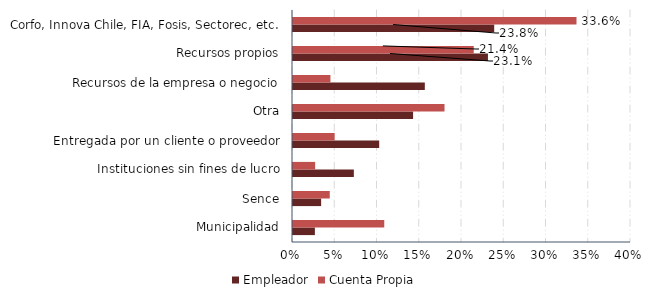
| Category | Empleador | Cuenta Propia |
|---|---|---|
| Municipalidad | 0.026 | 0.108 |
| Sence | 0.033 | 0.044 |
| Instituciones sin fines de lucro | 0.072 | 0.026 |
| Entregada por un cliente o proveedor | 0.102 | 0.049 |
| Otra | 0.142 | 0.179 |
| Recursos de la empresa o negocio | 0.156 | 0.044 |
| Recursos propios | 0.231 | 0.214 |
| Corfo, Innova Chile, FIA, Fosis, Sectorec, etc. | 0.238 | 0.335 |